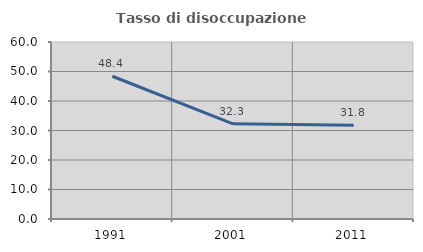
| Category | Tasso di disoccupazione giovanile  |
|---|---|
| 1991.0 | 48.387 |
| 2001.0 | 32.258 |
| 2011.0 | 31.818 |